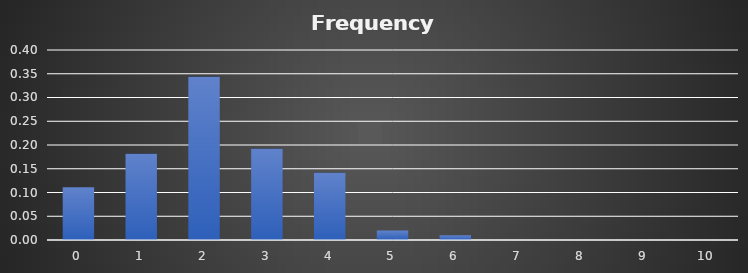
| Category | Series 0 |
|---|---|
| 0.0 | 0.111 |
| 1.0 | 0.182 |
| 2.0 | 0.343 |
| 3.0 | 0.192 |
| 4.0 | 0.141 |
| 5.0 | 0.02 |
| 6.0 | 0.01 |
| 7.0 | 0 |
| 8.0 | 0 |
| 9.0 | 0 |
| 10.0 | 0 |